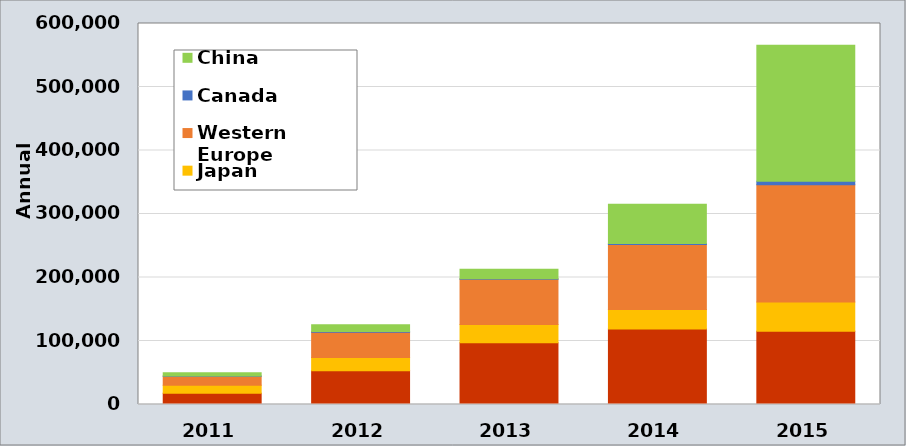
| Category | United States | Japan | Western Europe | Canada | China |
|---|---|---|---|---|---|
| 2011.0 | 17763 | 12600 | 14160 | 275 | 5202 |
| 2012.0 | 53169 | 20667 | 40000 | 1225 | 10699 |
| 2013.0 | 97102 | 28716 | 71233.333 | 931 | 15004 |
| 2014.0 | 118882 | 30567 | 102564.912 | 1521 | 61984 |
| 2015.0 | 115262 | 46339 | 184500 | 5284 | 214283 |